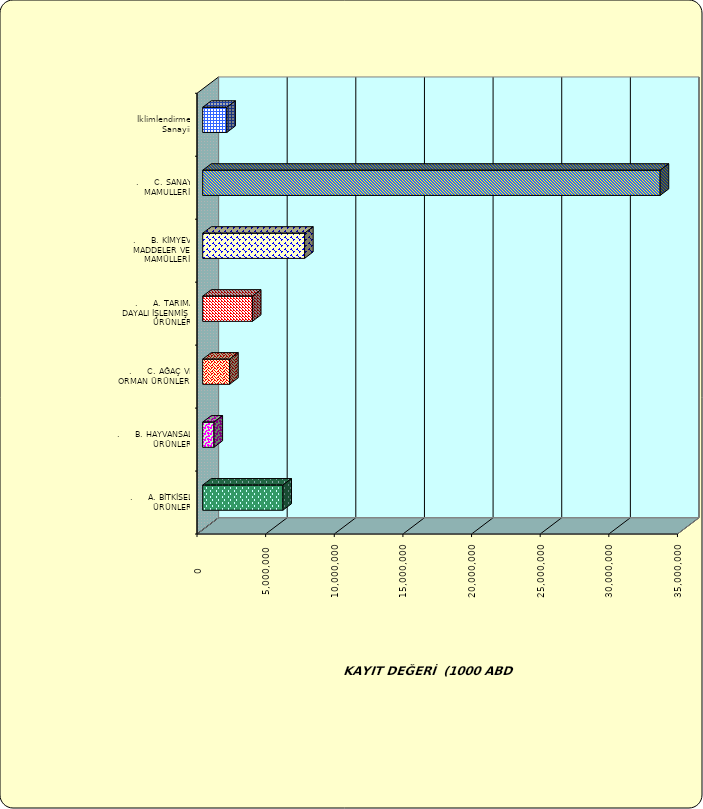
| Category | Series 0 |
|---|---|
| .     A. BİTKİSEL ÜRÜNLER | 5841563.359 |
| .     B. HAYVANSAL ÜRÜNLER | 821822.99 |
| .     C. AĞAÇ VE ORMAN ÜRÜNLERİ | 1962740.297 |
| .     A. TARIMA DAYALI İŞLENMİŞ ÜRÜNLER | 3621961.73 |
| .     B. KİMYEVİ MADDELER VE MAMÜLLERİ | 7422256.865 |
| .     C. SANAYİ MAMULLERİ | 33323520.94 |
|  İklimlendirme Sanayii | 1757132.501 |